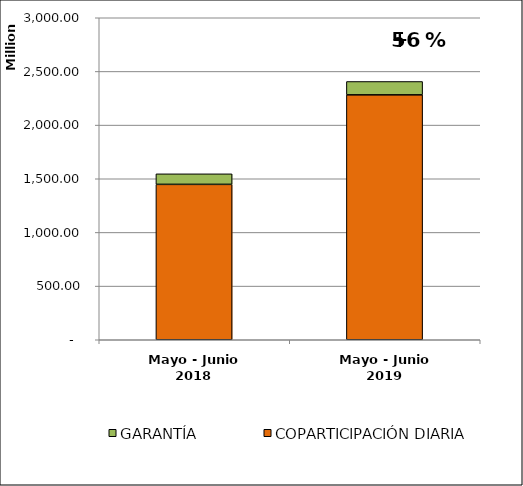
| Category | COPARTICIPACIÓN DIARIA | GARANTÍA |
|---|---|---|
| Mayo - Junio 2018 | 1447850393.22 | 98050755.82 |
| Mayo - Junio 2019 | 2281744711.3 | 124548216.25 |